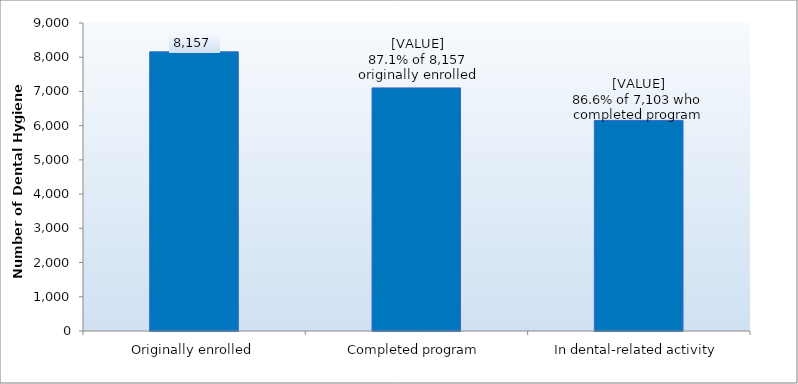
| Category | Series 0 |
|---|---|
| Originally enrolled | 8157 |
| Completed program | 7103 |
| In dental-related activity | 6154 |